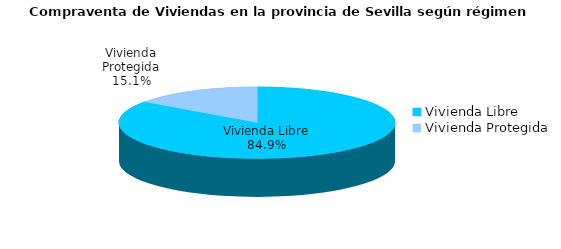
| Category | Series 0 | Series 1 |
|---|---|---|
| Vivienda Libre | 584 | 0.849 |
| Vivienda Protegida | 104 | 0.151 |